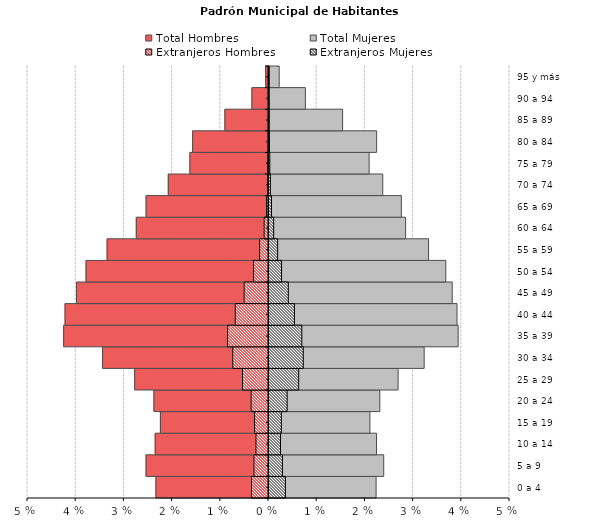
| Category | Total Hombres | Total Mujeres | Extranjeros Hombres | Extranjeros Mujeres |
|---|---|---|---|---|
| 0 a 4 | -0.023 | 0.022 | -0.004 | 0.003 |
| 5 a 9 | -0.025 | 0.024 | -0.003 | 0.003 |
| 10 a 14 | -0.024 | 0.022 | -0.003 | 0.002 |
| 15 a 19 | -0.022 | 0.021 | -0.003 | 0.003 |
| 20 a 24 | -0.024 | 0.023 | -0.004 | 0.004 |
| 25 a 29 | -0.028 | 0.027 | -0.005 | 0.006 |
| 30 a 34 | -0.034 | 0.032 | -0.007 | 0.007 |
| 35 a 39 | -0.043 | 0.039 | -0.008 | 0.007 |
| 40 a 44 | -0.042 | 0.039 | -0.007 | 0.005 |
| 45 a 49 | -0.04 | 0.038 | -0.005 | 0.004 |
| 50 a 54 | -0.038 | 0.037 | -0.003 | 0.003 |
| 55 a 59 | -0.033 | 0.033 | -0.002 | 0.002 |
| 60 a 64 | -0.027 | 0.028 | -0.001 | 0.001 |
| 65 a 69 | -0.025 | 0.027 | 0 | 0.001 |
| 70 a 74 | -0.021 | 0.024 | 0 | 0 |
| 75 a 79 | -0.016 | 0.021 | 0 | 0 |
| 80 a 84 | -0.016 | 0.022 | 0 | 0 |
| 85 a 89 | -0.009 | 0.015 | 0 | 0 |
| 90 a 94 | -0.003 | 0.008 | 0 | 0 |
| 95 y más | -0.001 | 0.002 | 0 | 0 |